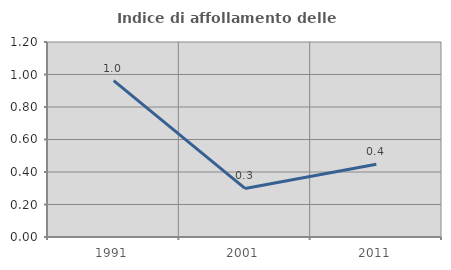
| Category | Indice di affollamento delle abitazioni  |
|---|---|
| 1991.0 | 0.962 |
| 2001.0 | 0.299 |
| 2011.0 | 0.448 |